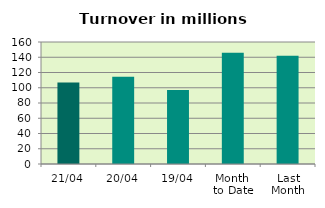
| Category | Series 0 |
|---|---|
| 21/04 | 106.9 |
| 20/04 | 114.542 |
| 19/04 | 96.929 |
| Month 
to Date | 145.958 |
| Last
Month | 142.086 |